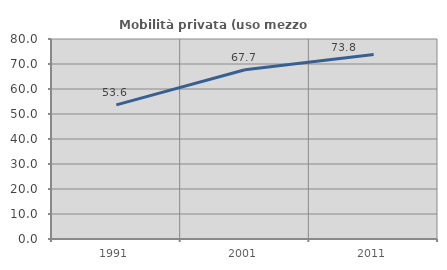
| Category | Mobilità privata (uso mezzo privato) |
|---|---|
| 1991.0 | 53.648 |
| 2001.0 | 67.69 |
| 2011.0 | 73.759 |